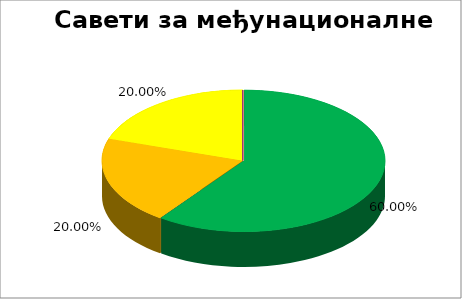
| Category | Савети за међунационалне односе |
|---|---|
| 0 | 0.6 |
| 1 | 0.2 |
| 2 | 0.2 |
| 3 | 0 |
| 4 | 0 |